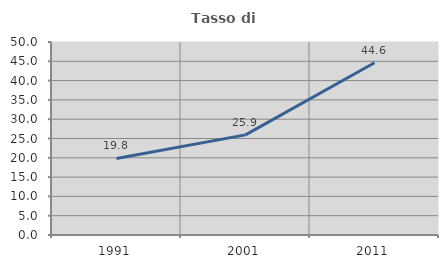
| Category | Tasso di occupazione   |
|---|---|
| 1991.0 | 19.821 |
| 2001.0 | 25.94 |
| 2011.0 | 44.631 |